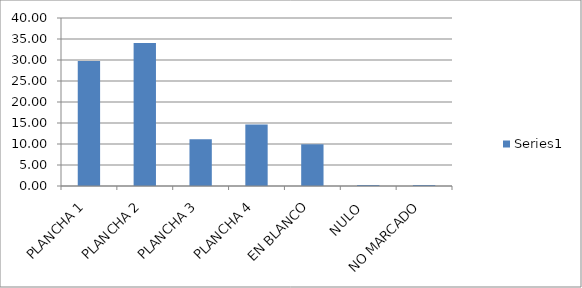
| Category | Series 0 |
|---|---|
| PLANCHA 1 | 29.787 |
| PLANCHA 2 | 34.043 |
| PLANCHA 3 | 11.111 |
| PLANCHA 4 | 14.657 |
| EN BLANCO | 9.929 |
| NULO  | 0.236 |
| NO MARCADO | 0.236 |